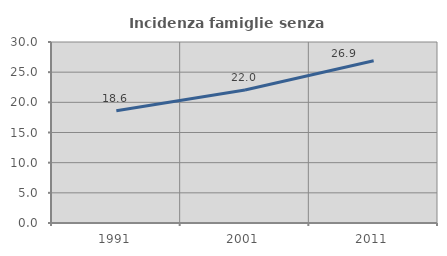
| Category | Incidenza famiglie senza nuclei |
|---|---|
| 1991.0 | 18.602 |
| 2001.0 | 22.043 |
| 2011.0 | 26.878 |